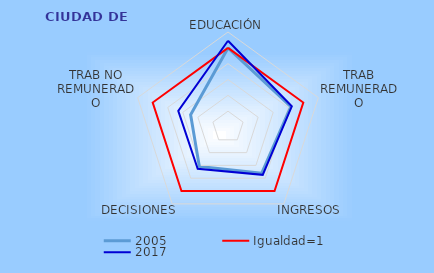
| Category | 2005 | Igualdad=1 | 2017 |
|---|---|---|---|
| EDUCACIÓN | 0.998 | 1 | 1.09 |
| TRAB REMUNERADO | 0.835 | 1 | 0.847 |
| INGRESOS | 0.723 | 1 | 0.747 |
| DECISIONES | 0.616 | 1 | 0.651 |
| TRAB NO REMUNERADO | 0.496 | 1 | 0.661 |